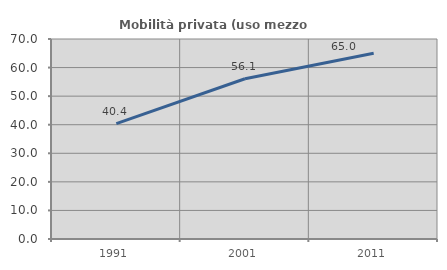
| Category | Mobilità privata (uso mezzo privato) |
|---|---|
| 1991.0 | 40.385 |
| 2001.0 | 56.085 |
| 2011.0 | 65.021 |